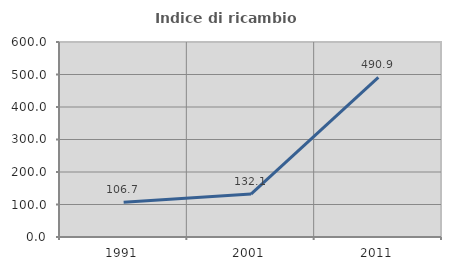
| Category | Indice di ricambio occupazionale  |
|---|---|
| 1991.0 | 106.667 |
| 2001.0 | 132.075 |
| 2011.0 | 490.909 |